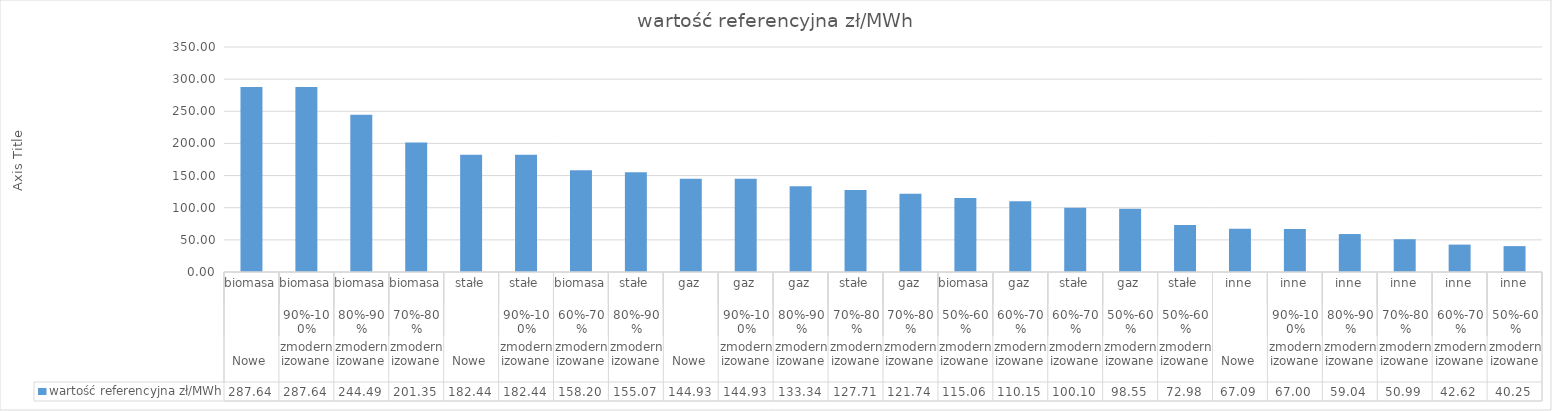
| Category | wartość referencyjna |
|---|---|
| 0 | 287.64 |
| 1 | 287.64 |
| 2 | 244.49 |
| 3 | 201.35 |
| 4 | 182.44 |
| 5 | 182.44 |
| 6 | 158.2 |
| 7 | 155.07 |
| 8 | 144.93 |
| 9 | 144.93 |
| 10 | 133.34 |
| 11 | 127.71 |
| 12 | 121.74 |
| 13 | 115.06 |
| 14 | 110.15 |
| 15 | 100.1 |
| 16 | 98.55 |
| 17 | 72.98 |
| 18 | 67.09 |
| 19 | 67 |
| 20 | 59.04 |
| 21 | 50.99 |
| 22 | 42.62 |
| 23 | 40.25 |